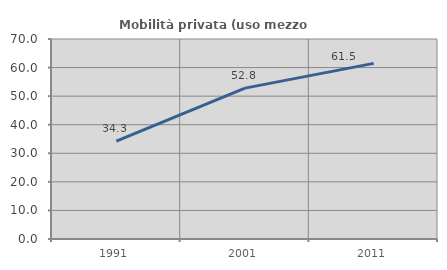
| Category | Mobilità privata (uso mezzo privato) |
|---|---|
| 1991.0 | 34.296 |
| 2001.0 | 52.809 |
| 2011.0 | 61.475 |